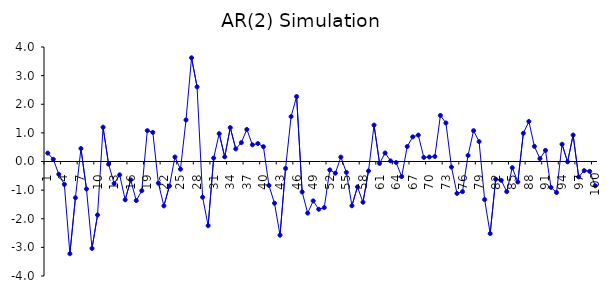
| Category | Series 0 |
|---|---|
| 1.0 | 0.293 |
| 2.0 | 0.076 |
| 3.0 | -0.447 |
| 4.0 | -0.799 |
| 5.0 | -3.221 |
| 6.0 | -1.267 |
| 7.0 | 0.454 |
| 8.0 | -0.96 |
| 9.0 | -3.037 |
| 10.0 | -1.868 |
| 11.0 | 1.198 |
| 12.0 | -0.094 |
| 13.0 | -0.769 |
| 14.0 | -0.466 |
| 15.0 | -1.337 |
| 16.0 | -0.643 |
| 17.0 | -1.365 |
| 18.0 | -1.021 |
| 19.0 | 1.078 |
| 20.0 | 1.017 |
| 21.0 | -0.757 |
| 22.0 | -1.55 |
| 23.0 | -0.856 |
| 24.0 | 0.156 |
| 25.0 | -0.269 |
| 26.0 | 1.451 |
| 27.0 | 3.623 |
| 28.0 | 2.607 |
| 29.0 | -1.248 |
| 30.0 | -2.242 |
| 31.0 | 0.12 |
| 32.0 | 0.972 |
| 33.0 | 0.162 |
| 34.0 | 1.183 |
| 35.0 | 0.44 |
| 36.0 | 0.659 |
| 37.0 | 1.119 |
| 38.0 | 0.583 |
| 39.0 | 0.628 |
| 40.0 | 0.517 |
| 41.0 | -0.837 |
| 42.0 | -1.457 |
| 43.0 | -2.573 |
| 44.0 | -0.243 |
| 45.0 | 1.57 |
| 46.0 | 2.269 |
| 47.0 | -1.064 |
| 48.0 | -1.803 |
| 49.0 | -1.376 |
| 50.0 | -1.668 |
| 51.0 | -1.61 |
| 52.0 | -0.293 |
| 53.0 | -0.409 |
| 54.0 | 0.154 |
| 55.0 | -0.381 |
| 56.0 | -1.546 |
| 57.0 | -0.887 |
| 58.0 | -1.422 |
| 59.0 | -0.331 |
| 60.0 | 1.272 |
| 61.0 | -0.066 |
| 62.0 | 0.296 |
| 63.0 | 0.02 |
| 64.0 | -0.035 |
| 65.0 | -0.528 |
| 66.0 | 0.523 |
| 67.0 | 0.861 |
| 68.0 | 0.923 |
| 69.0 | 0.142 |
| 70.0 | 0.157 |
| 71.0 | 0.175 |
| 72.0 | 1.608 |
| 73.0 | 1.346 |
| 74.0 | -0.194 |
| 75.0 | -1.115 |
| 76.0 | -1.054 |
| 77.0 | 0.211 |
| 78.0 | 1.076 |
| 79.0 | 0.696 |
| 80.0 | -1.33 |
| 81.0 | -2.519 |
| 82.0 | -0.619 |
| 83.0 | -0.657 |
| 84.0 | -1.053 |
| 85.0 | -0.216 |
| 86.0 | -0.715 |
| 87.0 | 0.988 |
| 88.0 | 1.399 |
| 89.0 | 0.53 |
| 90.0 | 0.099 |
| 91.0 | 0.388 |
| 92.0 | -0.905 |
| 93.0 | -1.082 |
| 94.0 | 0.603 |
| 95.0 | -0.012 |
| 96.0 | 0.923 |
| 97.0 | -0.538 |
| 98.0 | -0.318 |
| 99.0 | -0.345 |
| 100.0 | -0.848 |